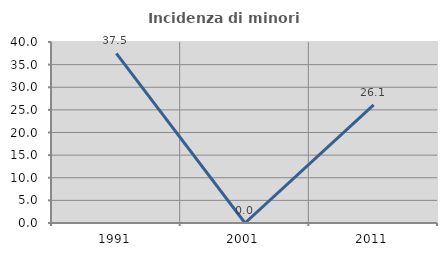
| Category | Incidenza di minori stranieri |
|---|---|
| 1991.0 | 37.5 |
| 2001.0 | 0 |
| 2011.0 | 26.087 |